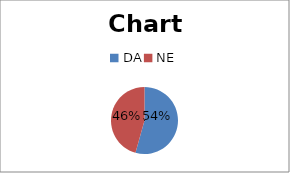
| Category | Series 0 |
|---|---|
| DA | 25 |
| NE | 21 |